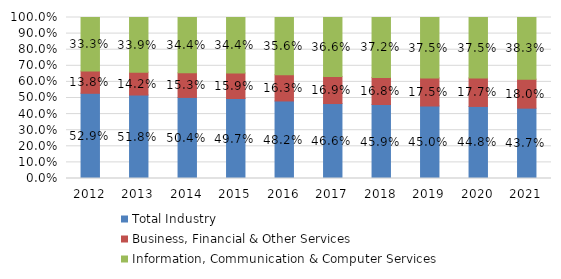
| Category | Total Industry | Business, Financial & Other Services | Information, Communication & Computer Services |
|---|---|---|---|
| 2012.0 | 0.529 | 0.138 | 0.333 |
| 2013.0 | 0.518 | 0.142 | 0.339 |
| 2014.0 | 0.504 | 0.153 | 0.344 |
| 2015.0 | 0.497 | 0.159 | 0.344 |
| 2016.0 | 0.482 | 0.163 | 0.356 |
| 2017.0 | 0.466 | 0.169 | 0.366 |
| 2018.0 | 0.459 | 0.168 | 0.372 |
| 2019.0 | 0.45 | 0.175 | 0.375 |
| 2020.0 | 0.448 | 0.177 | 0.375 |
| 2021.0 | 0.437 | 0.18 | 0.383 |